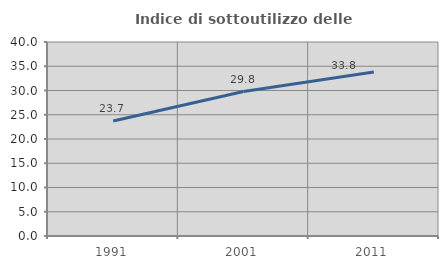
| Category | Indice di sottoutilizzo delle abitazioni  |
|---|---|
| 1991.0 | 23.711 |
| 2001.0 | 29.792 |
| 2011.0 | 33.8 |